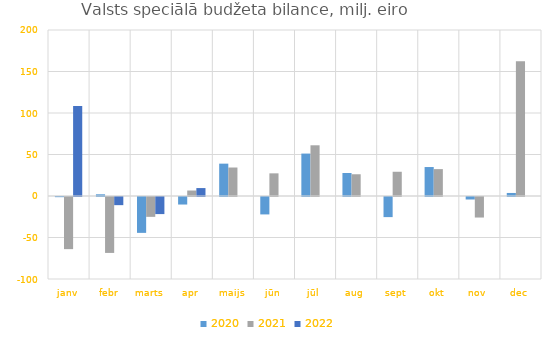
| Category | 2020 | 2021 | 2022 |
|---|---|---|---|
| janv | -199.839 | -62808.075 | 108554.179 |
| febr | 2049.427 | -67375.438 | -9818.538 |
| marts | -43219.176 | -23930.666 | -20590.078 |
| apr | -9074.401 | 6610.878 | 9551.101 |
| maijs | 38978.317 | 34323.187 | 0 |
| jūn | -20988.328 | 27288.039 | 0 |
| jūl | 51118.587 | 61101.998 | 0 |
| aug | 27698.363 | 26197.43 | 0 |
| sept | -24231.793 | 29202.435 | 0 |
| okt | 34894.946 | 32397.037 | 0 |
| nov | -3008.189 | -24738.863 | 0 |
| dec | 3652.649 | 162256.524 | 0 |